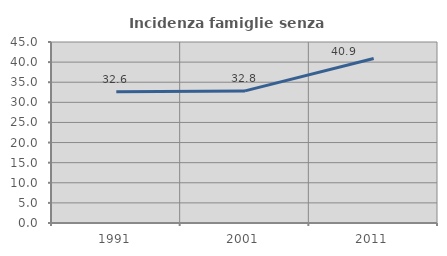
| Category | Incidenza famiglie senza nuclei |
|---|---|
| 1991.0 | 32.636 |
| 2001.0 | 32.845 |
| 2011.0 | 40.909 |